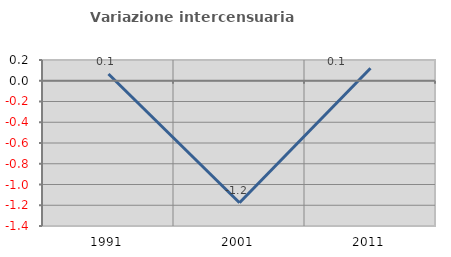
| Category | Variazione intercensuaria annua |
|---|---|
| 1991.0 | 0.065 |
| 2001.0 | -1.176 |
| 2011.0 | 0.12 |